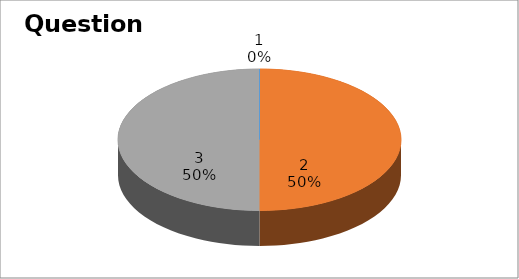
| Category | Series 0 |
|---|---|
| 0 | 0 |
| 1 | 5 |
| 2 | 5 |